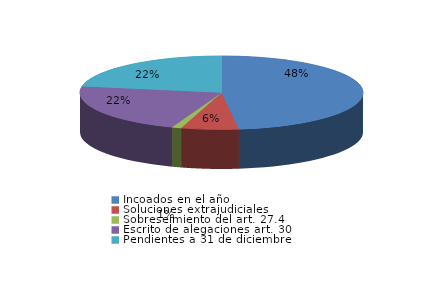
| Category | Series 0 |
|---|---|
| Incoados en el año | 311 |
| Soluciones extrajudiciales | 42 |
| Sobreseimiento del art. 27.4 | 7 |
| Escrito de alegaciones art. 30 | 143 |
| Pendientes a 31 de diciembre | 144 |